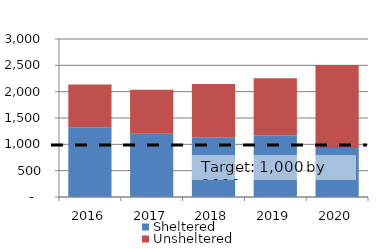
| Category | Sheltered | Unsheltered |
|---|---|---|
| 2016.0 | 1322 | 816 |
| 2017.0 | 1202 | 834 |
| 2018.0 | 1133 | 1014 |
| 2019.0 | 1169 | 1086 |
| 2020.0 | 932 | 1574 |